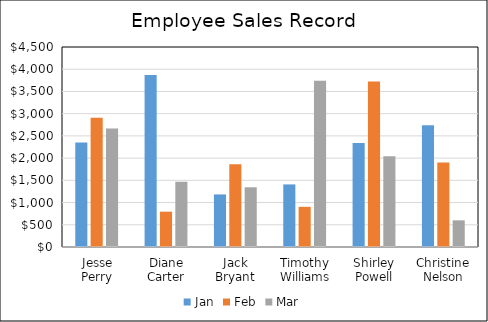
| Category | Jan | Feb | Mar |
|---|---|---|---|
| Jesse Perry | 2353 | 2909 | 2666 |
| Diane Carter | 3872 | 795 | 1466 |
| Jack Bryant | 1183 | 1864 | 1344 |
| Timothy Williams | 1408 | 904 | 3742 |
| Shirley Powell | 2342 | 3721 | 2040 |
| Christine Nelson | 2741 | 1901 | 600 |